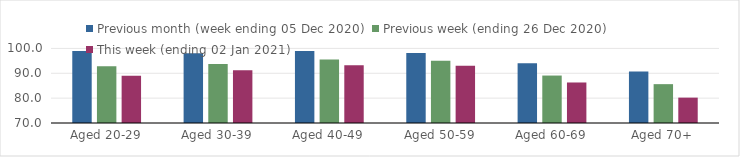
| Category | Previous month (week ending 05 Dec 2020) | Previous week (ending 26 Dec 2020) | This week (ending 02 Jan 2021) |
|---|---|---|---|
| Aged 20-29 | 98.98 | 92.82 | 89.03 |
| Aged 30-39 | 98.03 | 93.78 | 91.27 |
| Aged 40-49 | 99.01 | 95.5 | 93.25 |
| Aged 50-59 | 98.13 | 95 | 93.05 |
| Aged 60-69 | 94.06 | 89.09 | 86.3 |
| Aged 70+ | 90.68 | 85.63 | 80.21 |